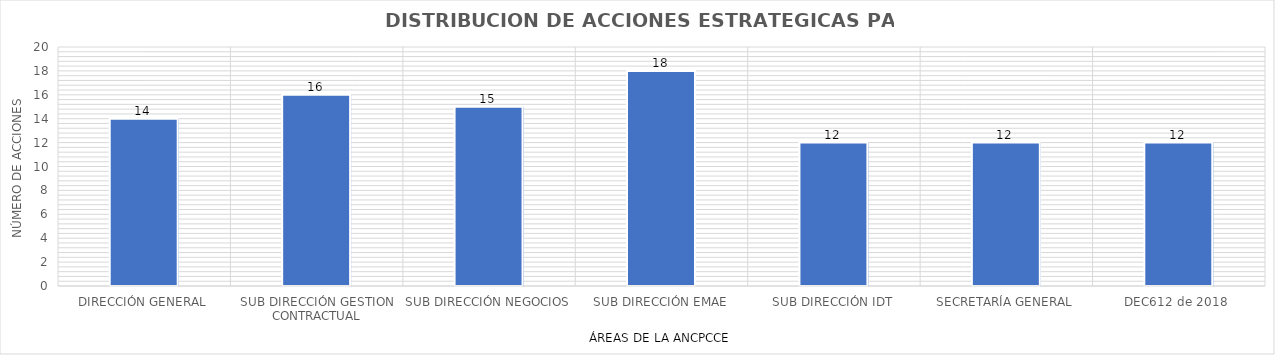
| Category | Series 0 |
|---|---|
| DIRECCIÓN GENERAL | 14 |
| SUB DIRECCIÓN GESTION CONTRACTUAL | 16 |
| SUB DIRECCIÓN NEGOCIOS | 15 |
| SUB DIRECCIÓN EMAE | 18 |
| SUB DIRECCIÓN IDT | 12 |
| SECRETARÍA GENERAL | 12 |
| DEC612 de 2018  | 12 |